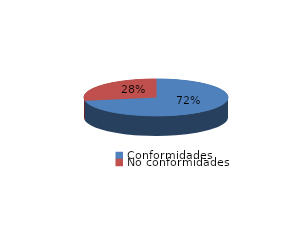
| Category | Series 0 |
|---|---|
| Conformidades | 1805 |
| No conformidades | 701 |